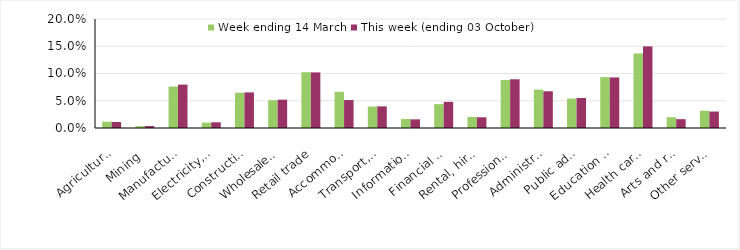
| Category | Week ending 14 March | This week (ending 03 October) |
|---|---|---|
| Agriculture, forestry and fishing | 0.012 | 0.011 |
| Mining | 0.003 | 0.004 |
| Manufacturing | 0.076 | 0.08 |
| Electricity, gas, water and waste services | 0.01 | 0.01 |
| Construction | 0.065 | 0.065 |
| Wholesale trade | 0.051 | 0.052 |
| Retail trade | 0.102 | 0.102 |
| Accommodation and food services | 0.066 | 0.051 |
| Transport, postal and warehousing | 0.039 | 0.04 |
| Information media and telecommunications | 0.017 | 0.016 |
| Financial and insurance services | 0.044 | 0.048 |
| Rental, hiring and real estate services | 0.02 | 0.02 |
| Professional, scientific and technical services | 0.088 | 0.089 |
| Administrative and support services | 0.07 | 0.067 |
| Public administration and safety | 0.054 | 0.055 |
| Education and training | 0.093 | 0.093 |
| Health care and social assistance | 0.137 | 0.15 |
| Arts and recreation services | 0.02 | 0.016 |
| Other services | 0.032 | 0.03 |